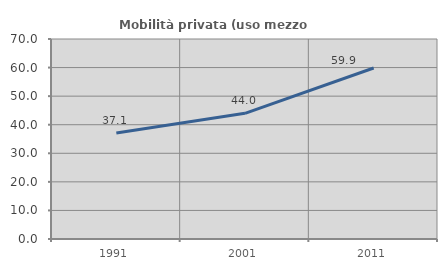
| Category | Mobilità privata (uso mezzo privato) |
|---|---|
| 1991.0 | 37.104 |
| 2001.0 | 43.99 |
| 2011.0 | 59.851 |